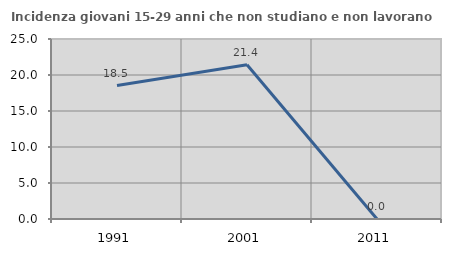
| Category | Incidenza giovani 15-29 anni che non studiano e non lavorano  |
|---|---|
| 1991.0 | 18.539 |
| 2001.0 | 21.429 |
| 2011.0 | 0 |